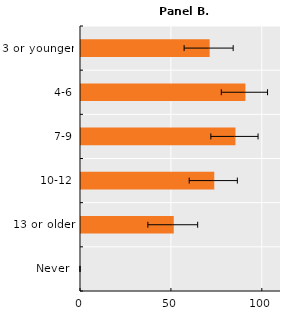
| Category | Series 0 |
|---|---|
| Never  | 0 |
| 13 or older | 51.022 |
| 10-12 | 73.296 |
| 7-9 | 84.945 |
| 4-6 | 90.432 |
| 3 or younger | 70.759 |